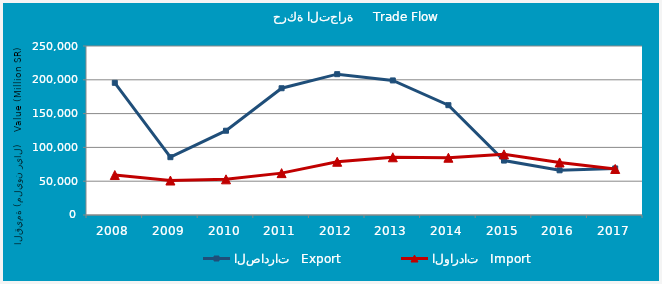
| Category | الصادرات   Export | الواردات   Import |
|---|---|---|
| 2008.0 | 195520774048 | 59106839522 |
| 2009.0 | 85532067655 | 50998881119 |
| 2010.0 | 124674704824 | 52749396948 |
| 2011.0 | 187522359730 | 61943326796 |
| 2012.0 | 208338675545 | 78769895690 |
| 2013.0 | 199060366165 | 85375664574 |
| 2014.0 | 162459717617 | 84729874530 |
| 2015.0 | 80524880859 | 89678212736 |
| 2016.0 | 66128136463 | 77727740881 |
| 2017.0 | 68866804196 | 68086489281 |